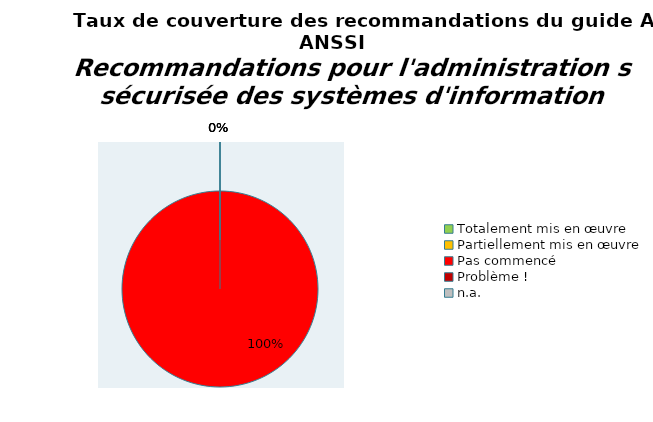
| Category | Series 0 |
|---|---|
| Totalement mis en œuvre | 0 |
| Partiellement mis en œuvre | 0 |
| Pas commencé | 77 |
| Problème ! | 0 |
| n.a. | 0 |